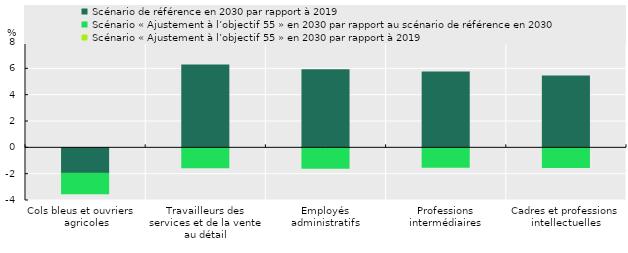
| Category | Scénario de référence en 2030 par rapport à 2019 | Scénario « Ajustement à l’objectif 55 » en 2030 par rapport au scénario de référence en 2030 |
|---|---|---|
| Cols bleus et ouvriers     agricoles | -1.93 | -1.555 |
| Travailleurs des services et de la vente au détail | 6.29 | -1.505 |
| Employés administratifs | 5.939 | -1.543 |
| Professions intermédiaires | 5.759 | -1.478 |
| Cadres et professions intellectuelles | 5.465 | -1.501 |